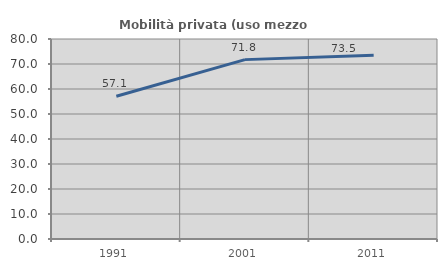
| Category | Mobilità privata (uso mezzo privato) |
|---|---|
| 1991.0 | 57.11 |
| 2001.0 | 71.75 |
| 2011.0 | 73.54 |